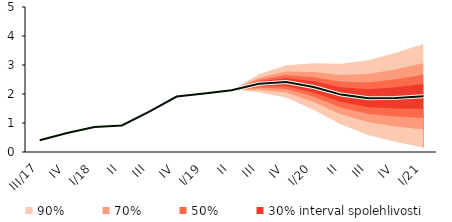
| Category | linka | Centerline |
|---|---|---|
| III/17 | 0.402 | 0.402 |
| IV | 0.654 | 0.654 |
| I/18 | 0.86 | 0.86 |
| II | 0.916 | 0.916 |
| III | 1.393 | 1.393 |
| IV | 1.913 | 1.913 |
| I/19 | 2.013 | 2.013 |
| II | 2.13 | 2.13 |
| III | 2.354 | 2.354 |
| IV | 2.414 | 2.414 |
| I/20 | 2.241 | 2.241 |
| II | 1.979 | 1.979 |
| III | 1.854 | 1.854 |
| IV | 1.866 | 1.866 |
| I/21 | 1.919 | 1.919 |